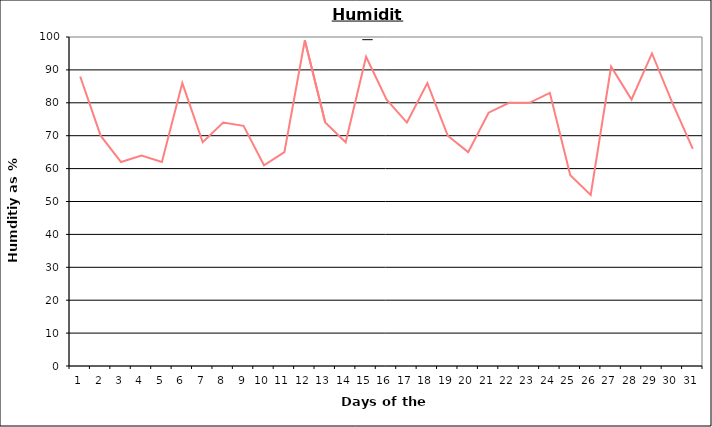
| Category | Series 0 |
|---|---|
| 0 | 88 |
| 1 | 70 |
| 2 | 62 |
| 3 | 64 |
| 4 | 62 |
| 5 | 86 |
| 6 | 68 |
| 7 | 74 |
| 8 | 73 |
| 9 | 61 |
| 10 | 65 |
| 11 | 99 |
| 12 | 74 |
| 13 | 68 |
| 14 | 94 |
| 15 | 81 |
| 16 | 74 |
| 17 | 86 |
| 18 | 70 |
| 19 | 65 |
| 20 | 77 |
| 21 | 80 |
| 22 | 80 |
| 23 | 83 |
| 24 | 58 |
| 25 | 52 |
| 26 | 91 |
| 27 | 81 |
| 28 | 95 |
| 29 | 80 |
| 30 | 66 |